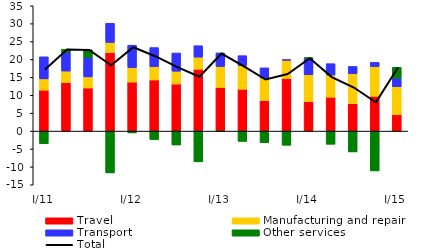
| Category | Travel | Manufacturing and repair | Transport  | Other services |
|---|---|---|---|---|
| I/11 | 11.431 | 3.156 | 6.162 | -3.509 |
| II | 13.528 | 3.236 | 5.236 | 0.875 |
| III | 12.037 | 3.104 | 5.449 | 2.149 |
| IV | 21.941 | 2.823 | 5.35 | -11.684 |
| I/12 | 13.692 | 4.048 | 6.252 | -0.513 |
| II | 14.269 | 3.724 | 5.341 | -2.361 |
| III | 13.14 | 3.585 | 5.083 | -3.885 |
| IV | 17.276 | 3.385 | 3.188 | -8.597 |
| I/13 | 12.195 | 5.852 | 3.788 | -0.133 |
| II | 11.675 | 6.652 | 2.738 | -2.878 |
| III | 8.529 | 6.323 | 2.82 | -3.214 |
| IV | 14.674 | 5.118 | 0.175 | -3.954 |
| I/14 | 8.232 | 7.495 | 4.681 | 0.01 |
| II | 9.456 | 6.213 | 3.163 | -3.68 |
| III | 7.658 | 8.378 | 2.02 | -5.821 |
| IV | 9.714 | 8.296 | 1.19 | -11.128 |
| I/15 | 4.557 | 7.828 | 2.408 | 3.015 |